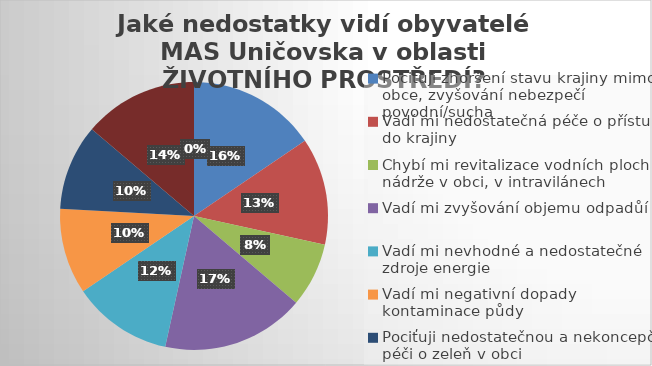
| Category | Series 0 |
|---|---|
| Pociťuji zhoršení stavu krajiny mimo obce, zvyšování nebezpečí povodní/sucha | 9 |
| Vadí mi nedostatečná péče o přístupy do krajiny | 7.5 |
| Chybí mi revitalizace vodních ploch – nádrže v obci, v intravilánech | 4.5 |
| Vadí mi zvyšování objemu odpadůí | 10 |
| Vadí mi nevhodné a nedostatečné zdroje energie | 7 |
| Vadí mi negativní dopady kontaminace půdy | 6 |
| Pociťuji nedostatečnou a nekoncepční péči o zeleň v obci | 6 |
| Vadí mi nedostatečná výsadba zeleně v obcích | 8 |